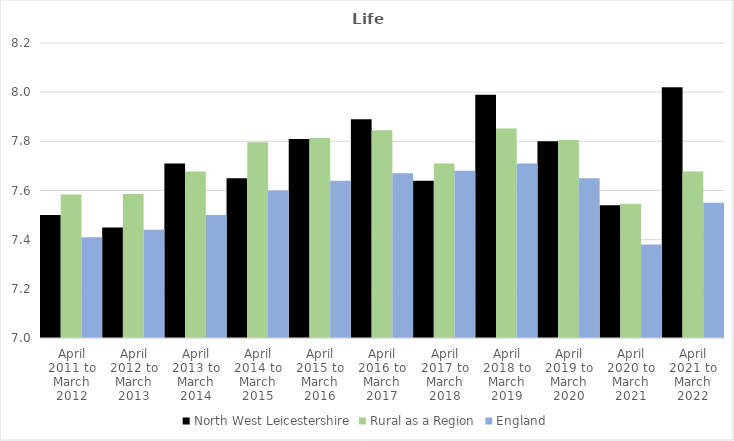
| Category | North West Leicestershire | Rural as a Region | England |
|---|---|---|---|
| April 2011 to March 2012 | 7.5 | 7.584 | 7.41 |
| April 2012 to March 2013 | 7.45 | 7.586 | 7.44 |
| April 2013 to March 2014 | 7.71 | 7.677 | 7.5 |
| April 2014 to March 2015 | 7.65 | 7.797 | 7.6 |
| April 2015 to March 2016 | 7.81 | 7.813 | 7.64 |
| April 2016 to March 2017 | 7.89 | 7.845 | 7.67 |
| April 2017 to March 2018 | 7.64 | 7.71 | 7.68 |
| April 2018 to March 2019 | 7.99 | 7.852 | 7.71 |
| April 2019 to March 2020 | 7.8 | 7.806 | 7.65 |
| April 2020 to March 2021 | 7.54 | 7.546 | 7.38 |
| April 2021 to March 2022 | 8.02 | 7.677 | 7.55 |